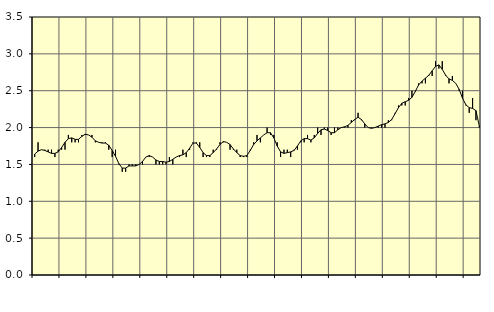
| Category | Piggar | Series 1 |
|---|---|---|
| nan | 1.6 | 1.64 |
| 87.0 | 1.8 | 1.68 |
| 87.0 | 1.7 | 1.7 |
| 87.0 | 1.7 | 1.69 |
| nan | 1.7 | 1.67 |
| 88.0 | 1.7 | 1.65 |
| 88.0 | 1.6 | 1.65 |
| 88.0 | 1.7 | 1.67 |
| nan | 1.7 | 1.73 |
| 89.0 | 1.7 | 1.8 |
| 89.0 | 1.9 | 1.85 |
| 89.0 | 1.8 | 1.86 |
| nan | 1.8 | 1.84 |
| 90.0 | 1.8 | 1.84 |
| 90.0 | 1.9 | 1.88 |
| 90.0 | 1.9 | 1.91 |
| nan | 1.9 | 1.9 |
| 91.0 | 1.9 | 1.87 |
| 91.0 | 1.8 | 1.82 |
| 91.0 | 1.8 | 1.8 |
| nan | 1.8 | 1.79 |
| 92.0 | 1.8 | 1.79 |
| 92.0 | 1.7 | 1.76 |
| 92.0 | 1.6 | 1.69 |
| nan | 1.7 | 1.61 |
| 93.0 | 1.5 | 1.51 |
| 93.0 | 1.4 | 1.45 |
| 93.0 | 1.4 | 1.45 |
| nan | 1.5 | 1.48 |
| 94.0 | 1.5 | 1.48 |
| 94.0 | 1.5 | 1.48 |
| 94.0 | 1.5 | 1.5 |
| nan | 1.5 | 1.54 |
| 95.0 | 1.6 | 1.6 |
| 95.0 | 1.6 | 1.62 |
| 95.0 | 1.6 | 1.6 |
| nan | 1.5 | 1.56 |
| 96.0 | 1.5 | 1.54 |
| 96.0 | 1.5 | 1.54 |
| 96.0 | 1.5 | 1.53 |
| nan | 1.6 | 1.54 |
| 97.0 | 1.5 | 1.57 |
| 97.0 | 1.6 | 1.6 |
| 97.0 | 1.6 | 1.62 |
| nan | 1.7 | 1.63 |
| 98.0 | 1.6 | 1.66 |
| 98.0 | 1.7 | 1.72 |
| 98.0 | 1.8 | 1.79 |
| nan | 1.8 | 1.79 |
| 99.0 | 1.8 | 1.73 |
| 99.0 | 1.6 | 1.66 |
| 99.0 | 1.6 | 1.62 |
| nan | 1.6 | 1.62 |
| 0.0 | 1.7 | 1.66 |
| 0.0 | 1.7 | 1.71 |
| 0.0 | 1.8 | 1.77 |
| nan | 1.8 | 1.81 |
| 1.0 | 1.8 | 1.8 |
| 1.0 | 1.7 | 1.77 |
| 1.0 | 1.7 | 1.71 |
| nan | 1.7 | 1.66 |
| 2.0 | 1.6 | 1.62 |
| 2.0 | 1.6 | 1.61 |
| 2.0 | 1.6 | 1.62 |
| nan | 1.7 | 1.69 |
| 3.0 | 1.8 | 1.77 |
| 3.0 | 1.9 | 1.82 |
| 3.0 | 1.8 | 1.86 |
| nan | 1.9 | 1.9 |
| 4.0 | 2 | 1.93 |
| 4.0 | 1.9 | 1.93 |
| 4.0 | 1.9 | 1.86 |
| nan | 1.8 | 1.75 |
| 5.0 | 1.6 | 1.67 |
| 5.0 | 1.7 | 1.65 |
| 5.0 | 1.7 | 1.66 |
| nan | 1.6 | 1.67 |
| 6.0 | 1.7 | 1.69 |
| 6.0 | 1.7 | 1.75 |
| 6.0 | 1.8 | 1.82 |
| nan | 1.8 | 1.85 |
| 7.0 | 1.9 | 1.85 |
| 7.0 | 1.8 | 1.83 |
| 7.0 | 1.9 | 1.86 |
| nan | 2 | 1.92 |
| 8.0 | 1.9 | 1.97 |
| 8.0 | 2 | 1.98 |
| 8.0 | 2 | 1.96 |
| nan | 1.9 | 1.93 |
| 9.0 | 2 | 1.93 |
| 9.0 | 2 | 1.97 |
| 9.0 | 2 | 2 |
| nan | 2 | 2.01 |
| 10.0 | 2 | 2.03 |
| 10.0 | 2.1 | 2.07 |
| 10.0 | 2.1 | 2.11 |
| nan | 2.2 | 2.14 |
| 11.0 | 2.1 | 2.11 |
| 11.0 | 2 | 2.05 |
| 11.0 | 2 | 2 |
| nan | 2 | 1.99 |
| 12.0 | 2 | 2 |
| 12.0 | 2 | 2.02 |
| 12.0 | 2 | 2.04 |
| nan | 2 | 2.05 |
| 13.0 | 2.1 | 2.07 |
| 13.0 | 2.1 | 2.11 |
| 13.0 | 2.2 | 2.19 |
| nan | 2.3 | 2.27 |
| 14.0 | 2.3 | 2.33 |
| 14.0 | 2.3 | 2.35 |
| 14.0 | 2.4 | 2.37 |
| nan | 2.5 | 2.41 |
| 15.0 | 2.5 | 2.49 |
| 15.0 | 2.6 | 2.58 |
| 15.0 | 2.6 | 2.63 |
| nan | 2.6 | 2.67 |
| 16.0 | 2.7 | 2.71 |
| 16.0 | 2.7 | 2.77 |
| 16.0 | 2.9 | 2.83 |
| nan | 2.8 | 2.85 |
| 17.0 | 2.9 | 2.79 |
| 17.0 | 2.7 | 2.71 |
| 17.0 | 2.6 | 2.66 |
| nan | 2.7 | 2.64 |
| 18.0 | 2.6 | 2.6 |
| 18.0 | 2.5 | 2.52 |
| 18.0 | 2.5 | 2.4 |
| nan | 2.3 | 2.31 |
| 19.0 | 2.2 | 2.27 |
| 19.0 | 2.4 | 2.26 |
| 19.0 | 2.1 | 2.23 |
| nan | 2 | 2.02 |